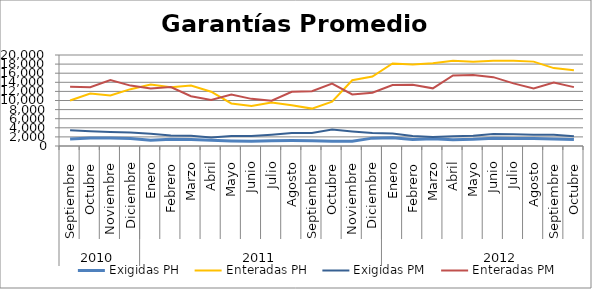
| Category | Exigidas PH | Enteradas PH | Exigidas PM | Enteradas PM |
|---|---|---|---|---|
| 0 | 1528.048 | 9989.528 | 3482.397 | 13040.893 |
| 1 | 1765.671 | 11522.563 | 3249.678 | 12931.878 |
| 2 | 1744.818 | 11123.372 | 3083.204 | 14519.409 |
| 3 | 1659.203 | 12493.623 | 2971.808 | 13273.812 |
| 4 | 1282.931 | 13511.197 | 2715.795 | 12631.271 |
| 5 | 1469.886 | 12912.935 | 2313.398 | 12967.84 |
| 6 | 1451.049 | 13292.147 | 2234.5 | 10944.124 |
| 7 | 1243.266 | 11940.059 | 1876.192 | 10106.188 |
| 8 | 1094.477 | 9346.935 | 2211.516 | 11309.35 |
| 9 | 1038.181 | 8772.488 | 2185.859 | 10360.845 |
| 10 | 1150.33 | 9583.522 | 2484.933 | 9954.534 |
| 11 | 1204.945 | 8947.225 | 2874.347 | 11912.953 |
| 12 | 1181.135 | 8218.837 | 2868.226 | 12046.458 |
| 13 | 1047.181 | 9725.758 | 3619.145 | 13704.352 |
| 14 | 1067.214 | 14456.861 | 3177.175 | 11327.495 |
| 15 | 1729.716 | 15271.717 | 2830.669 | 11719.895 |
| 16 | 1828.564 | 18155.583 | 2744.93 | 13413.991 |
| 17 | 1451.155 | 17917.734 | 2215.902 | 13440.832 |
| 18 | 1587.31 | 18166.129 | 1968.766 | 12673.714 |
| 19 | 1353.003 | 18741.256 | 2118.782 | 15515.723 |
| 20 | 1464.668 | 18540.927 | 2278.002 | 15625.393 |
| 21 | 1719.43 | 18734.539 | 2626.915 | 15127.903 |
| 22 | 1674.023 | 18761.463 | 2556.575 | 13766.49 |
| 23 | 1647.243 | 18544.546 | 2463.76 | 12637.427 |
| 24 | 1556.152 | 17124.972 | 2459.803 | 13929.715 |
| 25 | 1402.926 | 16653.067 | 2169.047 | 12937.81 |